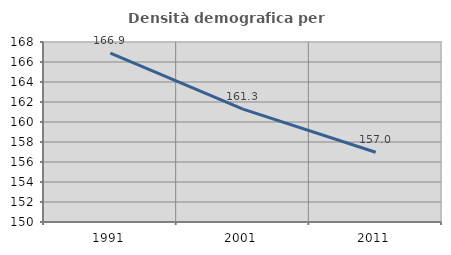
| Category | Densità demografica |
|---|---|
| 1991.0 | 166.881 |
| 2001.0 | 161.29 |
| 2011.0 | 156.977 |